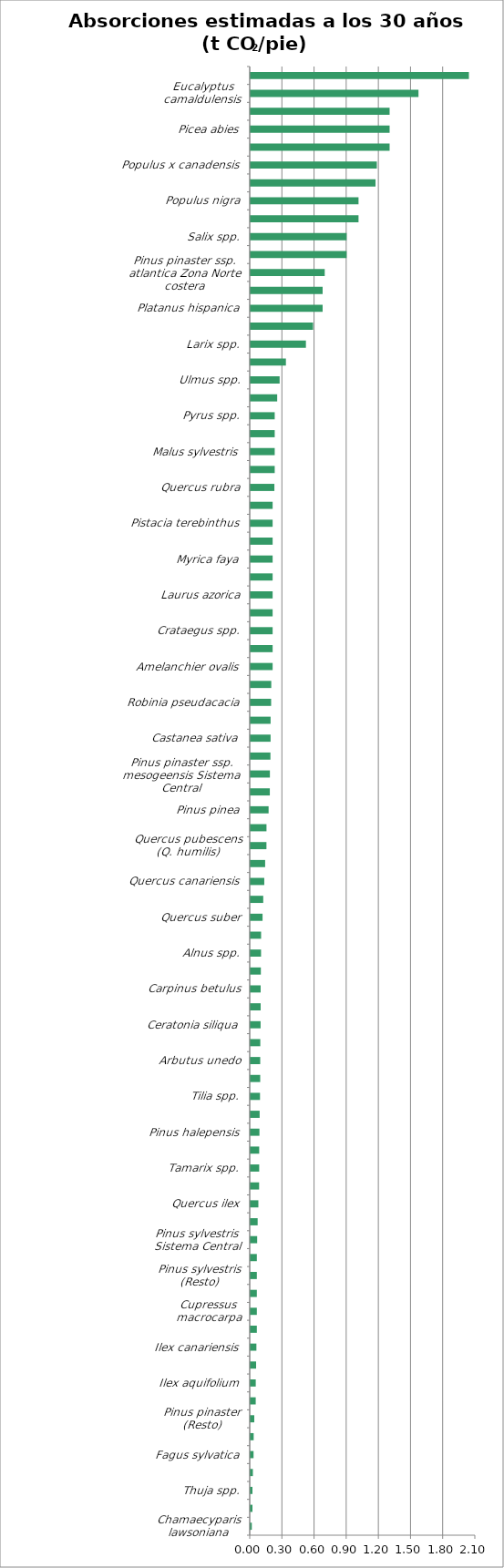
| Category | Series 0 |
|---|---|
| Chamaecyparis lawsoniana | 0.011 |
| Juniperus oxycedrus, J. communis | 0.017 |
| Thuja spp. | 0.017 |
| Juniperus thurifera | 0.021 |
| Fagus sylvatica | 0.027 |
| Juniperus phoenicea | 0.028 |
| Pinus pinaster (Resto) | 0.034 |
| Pinus sylvestris Sistema Ibérico | 0.047 |
| Ilex aquifolium | 0.048 |
| Pinus nigra Sistema Ibérico | 0.051 |
| Ilex canariensis | 0.054 |
| Cupressus arizonica | 0.058 |
| Cupressus macrocarpa | 0.058 |
| Cupressus sempervirens | 0.058 |
| Pinus sylvestris (Resto) | 0.058 |
| Taxus baccata | 0.058 |
| Pinus sylvestris Sistema Central | 0.061 |
| Pinus sylvestris Pirineos | 0.065 |
| Quercus ilex | 0.072 |
| Pinus nigra (Resto) | 0.079 |
| Tamarix spp. | 0.08 |
| Tetraclinis articulata | 0.08 |
| Pinus halepensis | 0.082 |
| Olea europaea | 0.084 |
| Tilia spp. | 0.087 |
| Phillyrea latifolia | 0.089 |
| Arbutus unedo | 0.089 |
| Pinus uncinata | 0.09 |
| Ceratonia siliqua | 0.093 |
| Betula spp. | 0.093 |
| Carpinus betulus | 0.093 |
| Abies alba | 0.095 |
| Alnus spp. | 0.097 |
| Quercus faginea | 0.098 |
| Quercus suber | 0.111 |
| Corylus avellana | 0.118 |
| Quercus canariensis | 0.127 |
| Pinus canariensis | 0.135 |
| Quercus pubescens (Q. humilis) | 0.148 |
| Quercus pyrenaica | 0.148 |
| Pinus pinea | 0.168 |
| Quercus petraea | 0.179 |
| Pinus pinaster ssp. mesogeensis Sistema Central | 0.18 |
| Fraxinus spp. | 0.185 |
| Castanea sativa | 0.186 |
| Juglans regia | 0.186 |
| Robinia pseudacacia | 0.191 |
| Quercus robur | 0.192 |
| Amelanchier ovalis | 0.205 |
| Cornus sanguinea | 0.205 |
| Crataegus spp. | 0.205 |
| Erica arborea (Canarias) | 0.205 |
| Laurus azorica | 0.205 |
| Laurus nobilis | 0.205 |
| Myrica faya | 0.205 |
| Myrtus communis | 0.205 |
| Pistacia terebinthus | 0.205 |
| Rhamnus alaternus | 0.205 |
| Quercus rubra | 0.222 |
| Acer spp. | 0.225 |
| Malus sylvestris | 0.225 |
| Prunus spp. | 0.225 |
| Pyrus spp. | 0.225 |
| Sorbus spp. | 0.248 |
| Ulmus spp. | 0.27 |
| Abies pinsapo | 0.329 |
| Larix spp. | 0.516 |
| Pinus pinaster ssp. atlantica Zona Norte interior | 0.582 |
| Platanus hispanica | 0.672 |
| Populus alba | 0.672 |
| Pinus pinaster ssp. atlantica Zona Norte costera | 0.691 |
| Phoenix spp. | 0.896 |
| Salix spp. | 0.896 |
| Celtis australis | 1.006 |
| Populus nigra | 1.006 |
| Pinus radiata | 1.165 |
| Populus x canadensis | 1.177 |
| Cedrus atlantica | 1.296 |
| Picea abies | 1.296 |
| Pseudotsuga menziesii | 1.296 |
| Eucalyptus camaldulensis | 1.566 |
| Eucalyptus globulus | 2.036 |